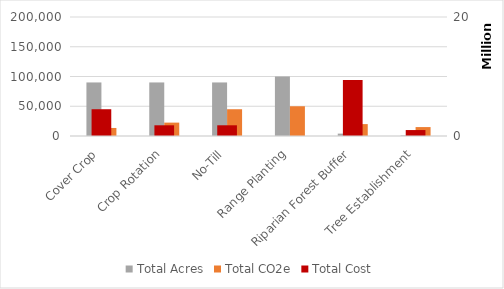
| Category | Total Acres | Total CO2e |
|---|---|---|
| Cover Crop | 90000 | 13500 |
| Crop Rotation | 90000 | 22500 |
| No-Till | 90000 | 45000 |
| Range Planting | 100000 | 50000 |
| Riparian Forest Buffer | 4000 | 20000 |
| Tree Establishment | 1000 | 15000 |